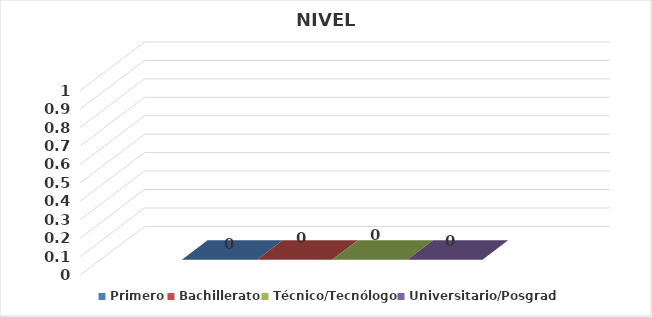
| Category | Primero | Bachillerato | Técnico/Tecnólogo | Universitario/Posgrado |
|---|---|---|---|---|
| 0 | 0 | 0 | 0 | 0 |